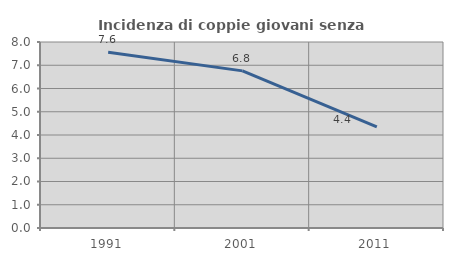
| Category | Incidenza di coppie giovani senza figli |
|---|---|
| 1991.0 | 7.555 |
| 2001.0 | 6.758 |
| 2011.0 | 4.352 |